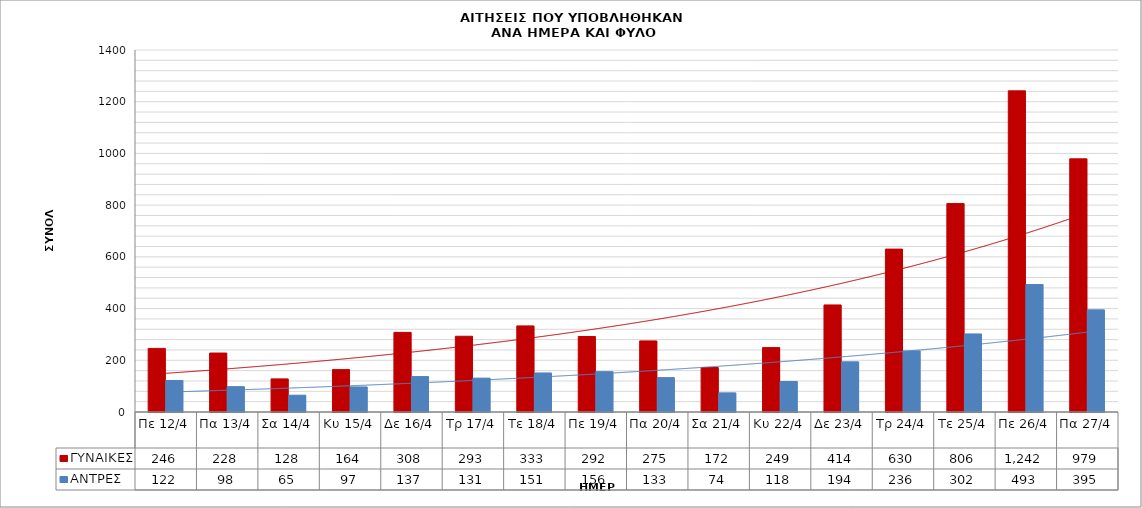
| Category | ΓΥΝΑΙΚΕΣ | ΑΝΤΡΕΣ |
|---|---|---|
| Πε 12/4 | 246 | 122 |
| Πα 13/4 | 228 | 98 |
| Σα 14/4 | 128 | 65 |
| Κυ 15/4 | 164 | 97 |
| Δε 16/4 | 308 | 137 |
| Τρ 17/4 | 293 | 131 |
| Τε 18/4 | 333 | 151 |
| Πε 19/4 | 292 | 156 |
| Πα 20/4 | 275 | 133 |
| Σα 21/4 | 172 | 74 |
| Κυ 22/4 | 249 | 118 |
| Δε 23/4 | 414 | 194 |
| Τρ 24/4 | 630 | 236 |
| Τε 25/4 | 806 | 302 |
| Πε 26/4 | 1242 | 493 |
| Πα 27/4 | 979 | 395 |